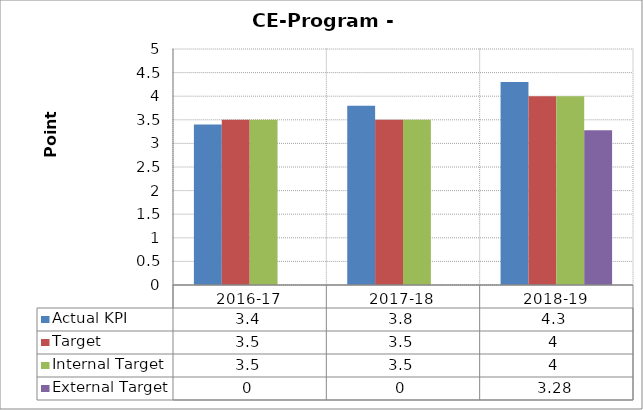
| Category | Actual KPI | Target  | Internal Target | External Target  |
|---|---|---|---|---|
| 2016-17 | 3.4 | 3.5 | 3.5 | 0 |
| 2017-18 | 3.8 | 3.5 | 3.5 | 0 |
| 2018-19 | 4.3 | 4 | 4 | 3.28 |